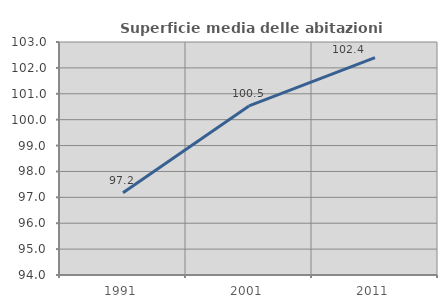
| Category | Superficie media delle abitazioni occupate |
|---|---|
| 1991.0 | 97.176 |
| 2001.0 | 100.532 |
| 2011.0 | 102.4 |